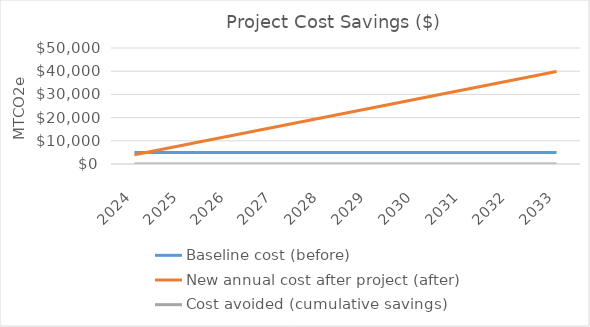
| Category | Baseline cost (before) | New annual cost after project (after) | Cost avoided (cumulative savings) |
|---|---|---|---|
| 0 | 4983 | 3986.4 |  |
| 1 | 4983 | 7972.8 |  |
| 2 | 4983 | 11959.2 |  |
| 3 | 4983 | 15945.6 |  |
| 4 | 4983 | 19932 |  |
| 5 | 4983 | 23918.4 |  |
| 6 | 4983 | 27904.8 |  |
| 7 | 4983 | 31891.2 |  |
| 8 | 4983 | 35877.6 |  |
| 9 | 4983 | 39864 |  |